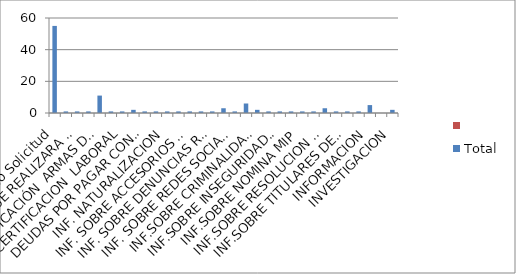
| Category | Total | Series 1 |
|---|---|---|
| Tipo Solicitud | 55 |  |
| ARTICULO 96 DE LA LEY 631-16 | 1 |  |
| CAMBIO QUE REALIZARA EL MIP EN RENOVACION DE ARM | 1 |  |
| CAMPAÑA DEARMAS DE FUEGO ME MATO POR UN PARQUE | 1 |  |
| CERTIFICACIÓN  ARMAS DE FUEGO | 11 |  |
| CERTIFICACION  EXP. LABORAL EN EL MIP | 1 |  |
| CERTIFICACION  LABORAL | 1 |  |
| COPIA CERTIFICADA | 2 |  |
| DEUDAS POR PAGAR CONTRAIDAS POR EL MIP | 1 |  |
| INF,SOBRE PLAN MI PAIS SEGURO | 1 |  |
| INF. NATURALIZACION | 1 |  |
| INF. PAGO PRESTACIONES  LABORALES MIP | 1 |  |
| INF. SOBRE ACCESORIOS PARA ARMAS | 1 |  |
| INF. SOBRE ACTIVIDADES NAVIDEÑAS MIP | 1 |  |
| INF. SOBRE DENUNCIAS ROBOS DE CELULARES | 1 |  |
| INF. SOBRE PRESTACIONES  LABORALES | 3 |  |
| INF. SOBRE REDES SOCIALES DEL MINISTERIO | 1 |  |
| INF..SOBRE PRESTACIONES  LABORALES | 6 |  |
| INF.SOBRE CRIMINALIDAD  EN RD. | 2 |  |
| INF.SOBRE DELINCUENCIA  EN JOVENES | 1 |  |
| INF.SOBRE INSEGURIDAD CIUDADANA | 1 |  |
| INF.SOBRE MONTO POLIZA DE SEGURO | 1 |  |
| INF.SOBRE NOMINA MIP | 1 |  |
| INF.SOBRE REQUISITOS PARA PRUEBA PSIQUIATRICA | 1 |  |
| INF.SOBRE RESOLUCION CONCEJO NACIONAL MIGRACION | 3 |  |
| INF.SOBRE SISTEMA DE GESTION AMBIENTAL ESTRATEGIC | 1 |  |
| INF.SOBRE TITULARES DEPARTAMENTO  CORRESPONDENC | 1 |  |
| INF.SOBRE TRASLADO FORMALES DEL MIP | 1 |  |
| INFORMACION | 5 |  |
|  | 0 |  |
| INVESTIGACION | 2 |  |